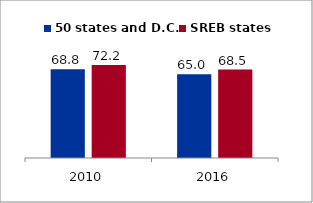
| Category | 50 states and D.C. | SREB states |
|---|---|---|
| 2010.0 | 68.833 | 72.16 |
| 2016.0 | 65.016 | 68.543 |